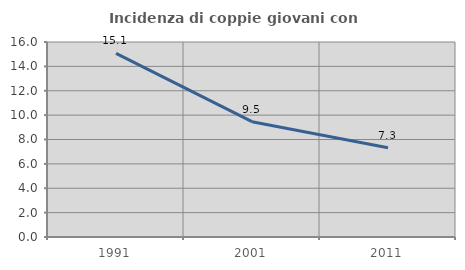
| Category | Incidenza di coppie giovani con figli |
|---|---|
| 1991.0 | 15.059 |
| 2001.0 | 9.461 |
| 2011.0 | 7.326 |